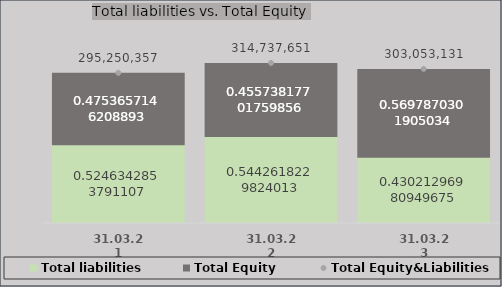
| Category | Total liabilities | Total Equity |
|---|---|---|
| 31.03.21 | 154898460.112 | 140351897.001 |
| 31.03.22 | 171299687.522 | 143437963.161 |
| 31.03.23 | 130377387.572 | 172675743.601 |